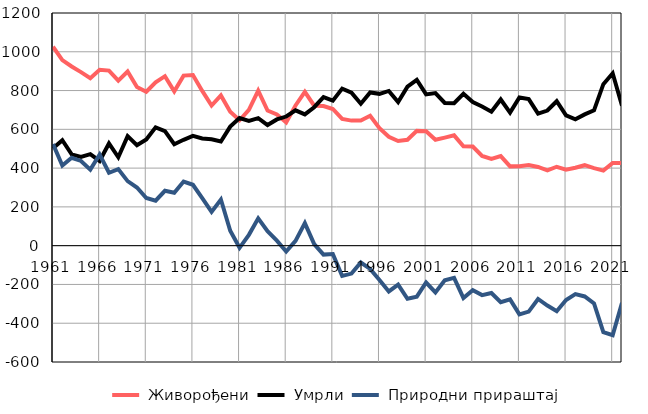
| Category |  Живорођени |  Умрли |  Природни прираштај |
|---|---|---|---|
| 1961.0 | 1026 | 502 | 524 |
| 1962.0 | 957 | 544 | 413 |
| 1963.0 | 924 | 471 | 453 |
| 1964.0 | 895 | 458 | 437 |
| 1965.0 | 864 | 472 | 392 |
| 1966.0 | 907 | 437 | 470 |
| 1967.0 | 903 | 527 | 376 |
| 1968.0 | 851 | 456 | 395 |
| 1969.0 | 898 | 565 | 333 |
| 1970.0 | 818 | 518 | 300 |
| 1971.0 | 794 | 548 | 246 |
| 1972.0 | 842 | 610 | 232 |
| 1973.0 | 874 | 591 | 283 |
| 1974.0 | 796 | 523 | 273 |
| 1975.0 | 877 | 546 | 331 |
| 1976.0 | 880 | 566 | 314 |
| 1977.0 | 798 | 553 | 245 |
| 1978.0 | 723 | 549 | 174 |
| 1979.0 | 775 | 537 | 238 |
| 1980.0 | 691 | 614 | 77 |
| 1981.0 | 647 | 658 | -11 |
| 1982.0 | 700 | 644 | 56 |
| 1983.0 | 799 | 658 | 141 |
| 1984.0 | 697 | 622 | 75 |
| 1985.0 | 677 | 651 | 26 |
| 1986.0 | 636 | 666 | -30 |
| 1987.0 | 723 | 698 | 25 |
| 1988.0 | 793 | 677 | 116 |
| 1989.0 | 722 | 714 | 8 |
| 1990.0 | 720 | 766 | -46 |
| 1991.0 | 705 | 748 | -43 |
| 1992.0 | 654 | 810 | -156 |
| 1993.0 | 645 | 789 | -144 |
| 1994.0 | 645 | 732 | -87 |
| 1995.0 | 670 | 790 | -120 |
| 1996.0 | 606 | 783 | -177 |
| 1997.0 | 562 | 798 | -236 |
| 1998.0 | 540 | 741 | -201 |
| 1999.0 | 546 | 820 | -274 |
| 2000.0 | 592 | 855 | -263 |
| 2001.0 | 590 | 780 | -190 |
| 2002.0 | 546 | 787 | -241 |
| 2003.0 | 557 | 736 | -179 |
| 2004.0 | 569 | 735 | -166 |
| 2005.0 | 513 | 783 | -270 |
| 2006.0 | 511 | 741 | -230 |
| 2007.0 | 463 | 718 | -255 |
| 2008.0 | 447 | 691 | -244 |
| 2009.0 | 462 | 754 | -292 |
| 2010.0 | 409 | 686 | -277 |
| 2011.0 | 410 | 764 | -354 |
| 2012.0 | 416 | 756 | -340 |
| 2013.0 | 406 | 681 | -275 |
| 2014.0 | 388 | 697 | -309 |
| 2015.0 | 407 | 745 | -338 |
| 2016.0 | 392 | 672 | -280 |
| 2017.0 | 402 | 652 | -250 |
| 2018.0 | 415 | 677 | -262 |
| 2019.0 | 400 | 698 | -298 |
| 2020.0 | 387 | 833 | -446 |
| 2021.0 | 427 | 889 | -462 |
| 2022.0 | 427 | 722 | -295 |